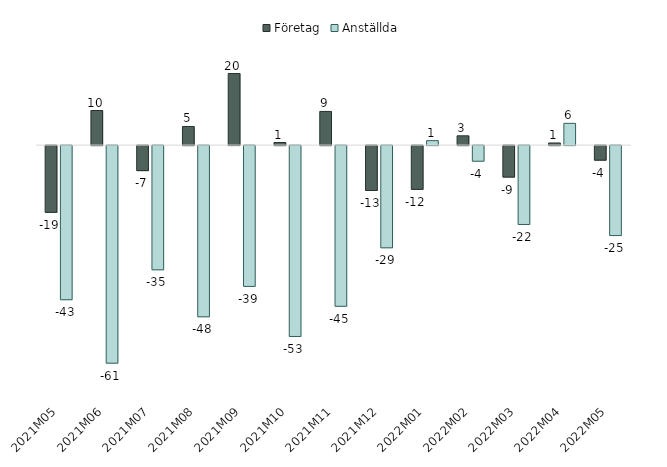
| Category | Företag | Anställda |
|---|---|---|
| 2021M05 | -18.7 | -43.172 |
| 2021M06 | 9.687 | -60.944 |
| 2021M07 | -7.008 | -34.794 |
| 2021M08 | 5.22 | -47.957 |
| 2021M09 | 20.047 | -39.444 |
| 2021M10 | 0.722 | -53.465 |
| 2021M11 | 9.431 | -45.011 |
| 2021M12 | -12.571 | -28.632 |
| 2022M01 | -12.252 | 1.242 |
| 2022M02 | 2.602 | -4.375 |
| 2022M03 | -8.815 | -22.096 |
| 2022M04 | 0.595 | 6.096 |
| 2022M05 | -4.078 | -25.203 |